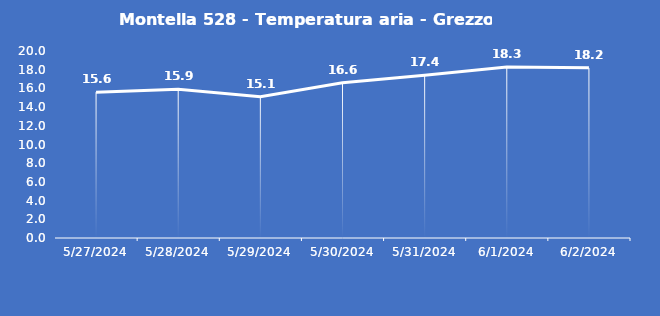
| Category | Montella 528 - Temperatura aria - Grezzo (°C) |
|---|---|
| 5/27/24 | 15.6 |
| 5/28/24 | 15.9 |
| 5/29/24 | 15.1 |
| 5/30/24 | 16.6 |
| 5/31/24 | 17.4 |
| 6/1/24 | 18.3 |
| 6/2/24 | 18.2 |